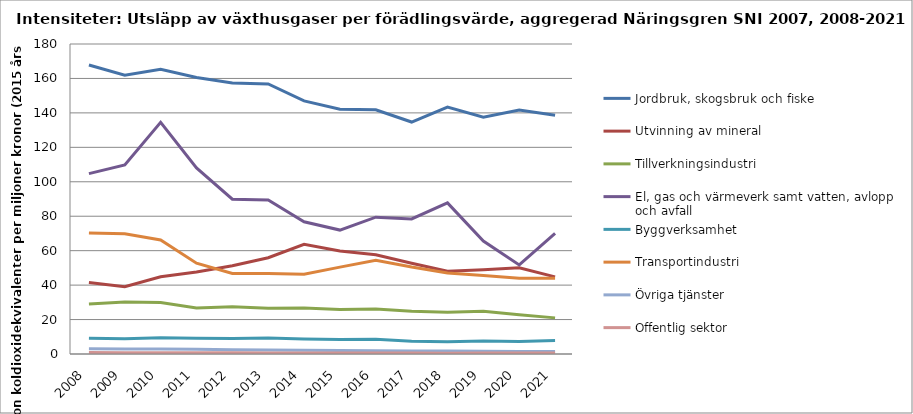
| Category | Jordbruk, skogsbruk och fiske | Utvinning av mineral | Tillverkningsindustri | El, gas och värmeverk samt vatten, avlopp och avfall | Byggverksamhet | Transportindustri | Övriga tjänster | Offentlig sektor |
|---|---|---|---|---|---|---|---|---|
| 2008 | 167.835 | 41.48 | 29.067 | 104.72 | 9.104 | 70.199 | 2.997 | 0.807 |
| 2009 | 161.824 | 39.125 | 30.146 | 109.822 | 8.826 | 69.807 | 2.856 | 0.759 |
| 2010 | 165.296 | 44.891 | 29.947 | 134.478 | 9.385 | 66.235 | 2.851 | 0.78 |
| 2011 | 160.605 | 47.658 | 26.689 | 108.069 | 9.205 | 52.699 | 2.734 | 0.699 |
| 2012 | 157.299 | 51.24 | 27.385 | 89.888 | 9.009 | 46.801 | 2.498 | 0.707 |
| 2013 | 156.83 | 55.885 | 26.619 | 89.375 | 9.234 | 46.725 | 2.364 | 0.617 |
| 2014 | 146.966 | 63.653 | 26.688 | 76.805 | 8.653 | 46.259 | 2.129 | 0.575 |
| 2015 | 142.165 | 59.87 | 25.77 | 71.954 | 8.36 | 50.428 | 2.008 | 0.561 |
| 2016 | 141.765 | 57.64 | 26.095 | 79.458 | 8.509 | 54.425 | 1.893 | 0.539 |
| 2017 | 134.684 | 52.735 | 24.841 | 78.417 | 7.429 | 50.472 | 1.809 | 0.51 |
| 2018 | 143.326 | 48.006 | 24.286 | 87.758 | 7.159 | 47.004 | 1.726 | 0.494 |
| 2019 | 137.502 | 48.938 | 24.768 | 65.596 | 7.513 | 45.626 | 1.668 | 0.528 |
| 2020 | 141.688 | 50.02 | 22.733 | 51.697 | 7.279 | 43.969 | 1.46 | 0.53 |
| 2021 | 138.629 | 44.792 | 20.978 | 70.022 | 7.796 | 43.995 | 1.414 | 0.509 |